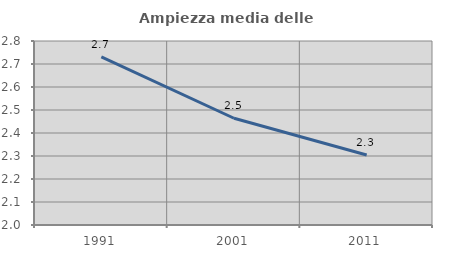
| Category | Ampiezza media delle famiglie |
|---|---|
| 1991.0 | 2.731 |
| 2001.0 | 2.464 |
| 2011.0 | 2.304 |